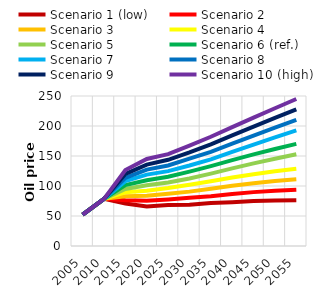
| Category | Scenario 1 (low) | Scenario 2 | Scenario 3 | Scenario 4 | Scenario 5 | Scenario 6 (ref.) | Scenario 7 | Scenario 8 | Scenario 9 | Scenario 10 (high) |
|---|---|---|---|---|---|---|---|---|---|---|
| 2005.0 | 52.373 | 52.373 | 52.373 | 52.373 | 52.373 | 52.373 | 52.373 | 52.373 | 52.373 | 52.373 |
| 2010.0 | 78.622 | 78.622 | 78.622 | 78.622 | 78.622 | 78.622 | 78.622 | 78.622 | 78.622 | 78.622 |
| 2015.0 | 70.796 | 76.385 | 82.906 | 89.426 | 95.016 | 101.536 | 108.057 | 113.646 | 120.167 | 126.688 |
| 2020.0 | 65.981 | 75.274 | 83.638 | 92.001 | 101.294 | 109.658 | 118.951 | 127.315 | 135.679 | 144.972 |
| 2025.0 | 68.185 | 77.626 | 87.067 | 96.508 | 105.949 | 115.39 | 124.831 | 134.272 | 143.714 | 153.155 |
| 2030.0 | 68.816 | 80.285 | 90.608 | 102.077 | 112.399 | 123.869 | 134.191 | 145.661 | 155.983 | 167.452 |
| 2035.0 | 71.586 | 82.889 | 95.448 | 108.007 | 120.566 | 133.125 | 144.429 | 156.988 | 169.547 | 182.106 |
| 2040.0 | 72.942 | 86.705 | 100.468 | 114.231 | 129.37 | 143.132 | 156.895 | 170.658 | 184.42 | 198.183 |
| 2045.0 | 74.832 | 89.799 | 104.765 | 119.731 | 137.691 | 152.658 | 169.121 | 184.087 | 199.054 | 214.02 |
| 2050.0 | 76 | 92.17 | 108.34 | 124.51 | 145.531 | 161.701 | 181.106 | 197.276 | 213.446 | 229.616 |
| 2055.0 | 76.445 | 93.819 | 111.193 | 128.567 | 152.89 | 170.264 | 192.85 | 210.224 | 227.598 | 244.971 |